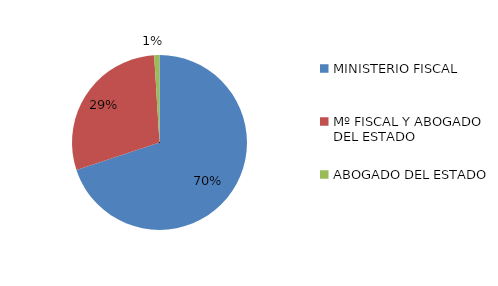
| Category | Series 0 |
|---|---|
| MINISTERIO FISCAL | 72 |
| Mº FISCAL Y ABOGADO DEL ESTADO | 30 |
| ABOGADO DEL ESTADO | 1 |